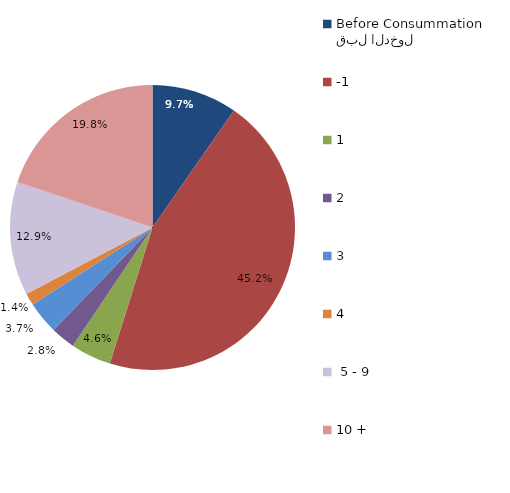
| Category | Series 0 |
|---|---|
| قبل الدخول
Before Consummation | 9.677 |
| -1 | 45.161 |
| 1 | 4.608 |
| 2 | 2.765 |
| 3 | 3.687 |
| 4 | 1.382 |
|  5 - 9 | 12.903 |
| 10 + | 19.816 |